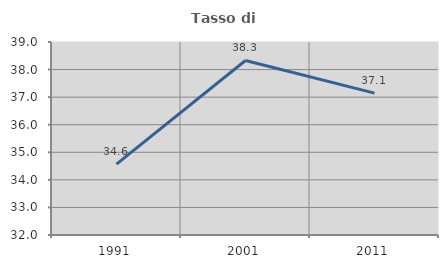
| Category | Tasso di occupazione   |
|---|---|
| 1991.0 | 34.572 |
| 2001.0 | 38.329 |
| 2011.0 | 37.145 |